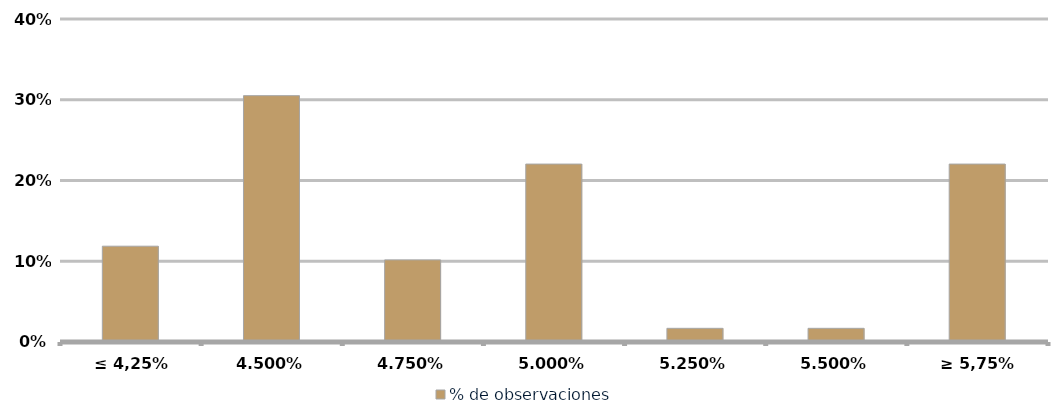
| Category | % de observaciones  |
|---|---|
| ≤ 4,25% | 0.119 |
| 4,50% | 0.305 |
| 4,75% | 0.102 |
| 5,00% | 0.22 |
| 5,25% | 0.017 |
| 5,50% | 0.017 |
| ≥ 5,75% | 0.22 |